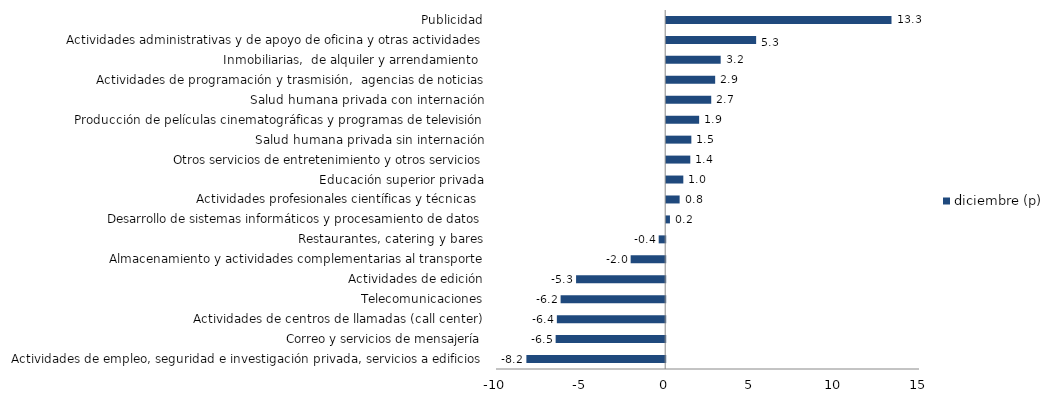
| Category | diciembre (p) |
|---|---|
| Actividades de empleo, seguridad e investigación privada, servicios a edificios | -8.204 |
| Correo y servicios de mensajería | -6.475 |
| Actividades de centros de llamadas (call center) | -6.403 |
| Telecomunicaciones | -6.182 |
| Actividades de edición | -5.268 |
| Almacenamiento y actividades complementarias al transporte | -2.042 |
| Restaurantes, catering y bares | -0.385 |
| Desarrollo de sistemas informáticos y procesamiento de datos | 0.222 |
| Actividades profesionales científicas y técnicas  | 0.794 |
| Educación superior privada | 1.012 |
| Otros servicios de entretenimiento y otros servicios | 1.424 |
| Salud humana privada sin internación | 1.487 |
| Producción de películas cinematográficas y programas de televisión | 1.947 |
| Salud humana privada con internación | 2.661 |
| Actividades de programación y trasmisión,  agencias de noticias | 2.894 |
| Inmobiliarias,  de alquiler y arrendamiento  | 3.22 |
| Actividades administrativas y de apoyo de oficina y otras actividades | 5.316 |
| Publicidad | 13.316 |